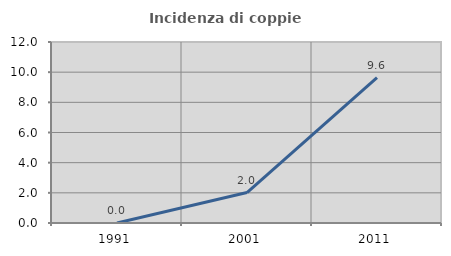
| Category | Incidenza di coppie miste |
|---|---|
| 1991.0 | 0 |
| 2001.0 | 2.02 |
| 2011.0 | 9.639 |